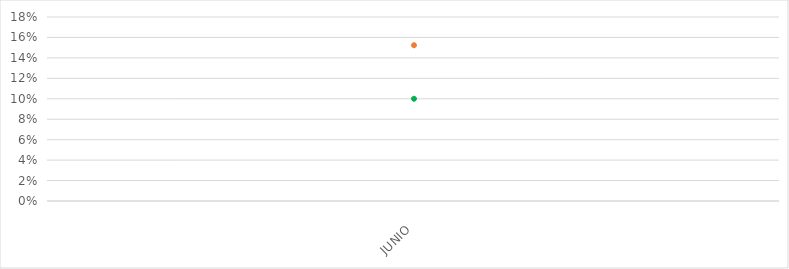
| Category | VALOR  | META PONDERADA |
|---|---|---|
| JUNIO | 0.152 | 0.1 |